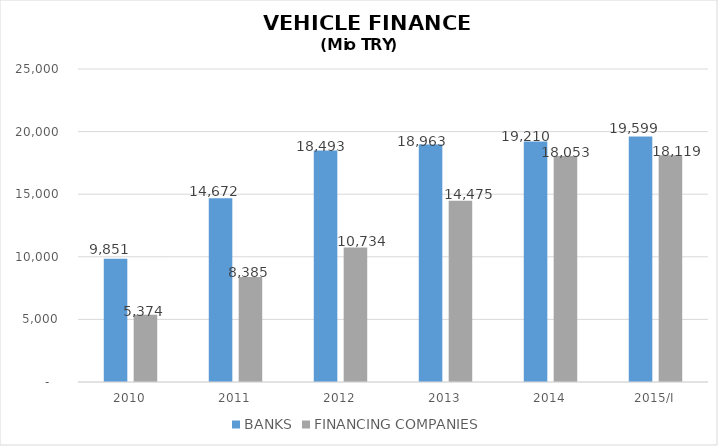
| Category | BANKS | FINANCING COMPANIES |
|---|---|---|
| 2010 | 9850.819 | 5374 |
| 2011 | 14672.044 | 8385 |
| 2012 | 18492.664 | 10734 |
| 2013 | 18963.054 | 14475 |
| 2014 | 19210.334 | 18053 |
| 2015/I | 19599 | 18119 |